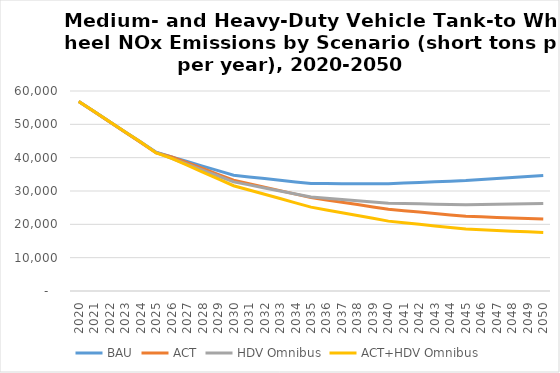
| Category | BAU | ACT | HDV Omnibus | ACT+HDV Omnibus |
|---|---|---|---|---|
| 2020.0 | 56870 | 56870 | 56870 | 56870 |
| 2021.0 | 53820 | 53790 | 53820 | 53820 |
| 2022.0 | 50770 | 50710 | 50770 | 50770 |
| 2023.0 | 47720 | 47620 | 47720 | 47720 |
| 2024.0 | 44670 | 44540 | 44670 | 44670 |
| 2025.0 | 41620 | 41460 | 41560 | 41410 |
| 2026.0 | 40240 | 40240 | 39790 | 39790 |
| 2027.0 | 38860 | 38500 | 38030 | 37740 |
| 2028.0 | 37480 | 36760 | 36260 | 35690 |
| 2029.0 | 36100 | 35010 | 34500 | 33630 |
| 2030.0 | 34720 | 33270 | 32730 | 31580 |
| 2031.0 | 34220 | 32220 | 31830 | 30300 |
| 2032.0 | 33720 | 31170 | 30920 | 29010 |
| 2033.0 | 33220 | 30120 | 30020 | 27730 |
| 2034.0 | 32720 | 29070 | 29110 | 26440 |
| 2035.0 | 32220 | 28020 | 28210 | 25160 |
| 2036.0 | 32220 | 27320 | 27830 | 24320 |
| 2037.0 | 32210 | 26620 | 27450 | 23480 |
| 2038.0 | 32210 | 25920 | 27080 | 22640 |
| 2039.0 | 32200 | 25220 | 26700 | 21800 |
| 2040.0 | 32200 | 24520 | 26320 | 20960 |
| 2041.0 | 32390 | 24100 | 26230 | 20480 |
| 2042.0 | 32580 | 23670 | 26140 | 20000 |
| 2043.0 | 32760 | 23250 | 26040 | 19530 |
| 2044.0 | 32950 | 22820 | 25950 | 19050 |
| 2045.0 | 33140 | 22400 | 25860 | 18570 |
| 2046.0 | 33450 | 22240 | 25940 | 18370 |
| 2047.0 | 33750 | 22070 | 26020 | 18170 |
| 2048.0 | 34060 | 21910 | 26110 | 17960 |
| 2049.0 | 34360 | 21740 | 26190 | 17760 |
| 2050.0 | 34670 | 21580 | 26270 | 17560 |